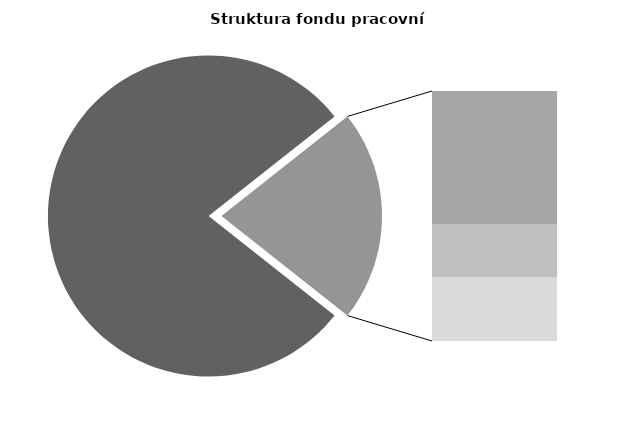
| Category | Series 0 |
|---|---|
| Průměrná měsíční odpracovaná doba bez přesčasu | 135.538 |
| Dovolená | 19.493 |
| Nemoc | 7.769 |
| Jiné | 9.399 |